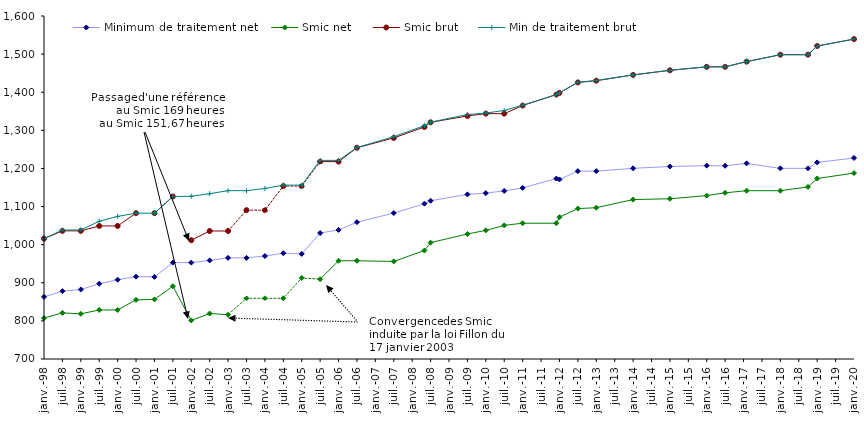
| Category | Minimum de traitement net | Smic net  | Smic brut  | Min de traitement brut |
|---|---|---|---|---|
| 1998-01-01 | 862.99 | 807.51 | 1015.87 | 1015.87 |
| 1998-07-01 | 878.01 | 821.103 | 1036.22 | 1038.46 |
| 1999-01-01 | 882.34 | 818.513 | 1036.22 | 1038.58 |
| 1999-07-01 | 897.46 | 828.688 | 1049.11 | 1061.44 |
| 2000-01-01 | 908.18 | 828.688 | 1049.11 | 1074.13 |
| 2000-07-01 | 916 | 855.144 | 1082.6 | 1082.6 |
| 2001-01-01 | 915.58 | 856.335 | 1082.6 | 1082.6 |
| 2001-07-01 | 952.93 | 890.98 | 1126.4 | 1126.4 |
| 2002-01-01 | 952.9 | 801.218 | 1011.64 | 1127.03 |
| 2002-07-01 | 958.62 | 819.38 | 1035.88 | 1133.79 |
| 2003-01-01 | 965.32 | 816.27 | 1035.88 | 1141.73 |
| 2003-07-01 | 965.32 | 859.32 | 1090.51 | 1141.73 |
| 2004-01-01 | 970.15 | 859.32 | 1090.51 | 1147.43 |
| 2004-07-01 | 977.6 | 859.32 | 1153.76 | 1156.23 |
| 2005-01-01 | 975.74 | 912.73 | 1153.76 | 1156.23 |
| 2005-07-01 | 1030.493 | 909.496 | 1217.88 | 1221.11 |
| 2006-01-01 | 1038.75 | 957.74 | 1217.88 | 1221.11 |
| 2006-07-01 | 1059.1 | 957.74 | 1254.28 | 1255.02 |
| 2007-07-01 | 1082.892 | 956.04 | 1280.07 | 1283.2 |
| 2008-05-01 | 1107.534 | 984.61 | 1308.88 | 1312.4 |
| 2008-07-01 | 1115.222 | 1005.36 | 1321.02 | 1321.52 |
| 2009-07-01 | 1131.915 | 1028 | 1337.7 | 1341.29 |
| 2010-01-01 | 1135.316 | 1037.53 | 1343.77 | 1345.32 |
| 2010-07-01 | 1140.995 | 1050.63 | 1343.77 | 1352.05 |
| 2011-01-01 | 1149.029 | 1056.24 | 1365 | 1365.94 |
| 2011-12-01 | 1173.351 | 1056.24 | 1393.82 | 1393.82 |
| 2012-01-01 | 1171.136 | 1072.07 | 1398.37 | 1398.37 |
| 2012-07-01 | 1192.958 | 1094.71 | 1425.67 | 1426.13 |
| 2013-01-01 | 1192.968 | 1096.94 | 1430.22 | 1430.76 |
| 2014-01-01 | 1200.271 | 1118.36 | 1445.38 | 1445.38 |
| 2015-01-01 | 1205.126 | 1120.43 | 1457.52 | 1457.52 |
| 2016-01-01 | 1207.333 | 1128.7 | 1466.62 | 1466.62 |
| 2016-07-01 | 1206.909 | 1135.99 | 1466.62 | 1466.62 |
| 2017-02-01 | 1213.309 | 1141.61 | 1480.27 | 1480.27 |
| 2018-01-01 | 1200.231 | 1141.61 | 1498.47 | 1498.47 |
| 2018-10-01 | 1200.231 | 1151.5 | 1498.47 | 1498.47 |
| 2019-01-01 | 1215.766 | 1173.6 | 1521.22 | 1521.22 |
| 2020-01-01 | 1227.41 | 1187.83 | 1539.42 | 1539.42 |